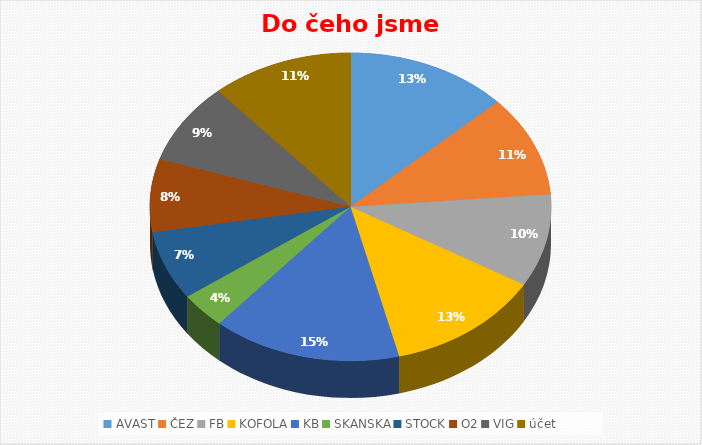
| Category | Series 0 |
|---|---|
| AVAST | 836.78 |
| ČEZ | 679.5 |
| FB | 622.22 |
| KOFOLA | 812.3 |
| KB | 974 |
| SKANSKA | 242 |
| STOCK | 463.5 |
| O2 | 489.5 |
| VIG | 546.5 |
| účet | 733.7 |